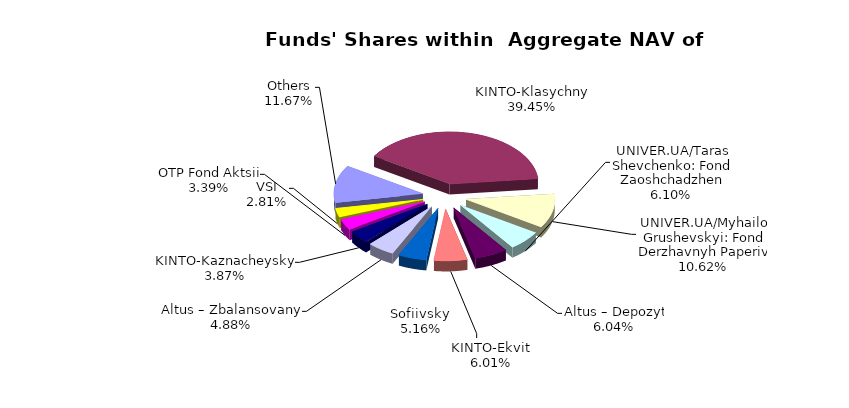
| Category | Series 0 | Series 1 |
|---|---|---|
| Others | 6261832.271 | 0.117 |
| KINTO-Klasychnyi | 21175658.039 | 0.395 |
| UNIVER.UA/Myhailo Grushevskyi: Fond Derzhavnyh Paperiv | 5698781.03 | 0.106 |
| UNIVER.UA/Taras Shevchenko: Fond Zaoshchadzhen | 3275766 | 0.061 |
| Altus – Depozyt | 3241102.16 | 0.06 |
| KINTO-Ekviti | 3225725.63 | 0.06 |
| Sofiivskyi | 2768298.132 | 0.052 |
| Altus – Zbalansovanyi | 2618962.38 | 0.049 |
| KINTO-Kaznacheyskyi | 2075833.3 | 0.039 |
| OTP Fond Aktsii | 1818548.09 | 0.034 |
| VSI | 1509915.44 | 0.028 |